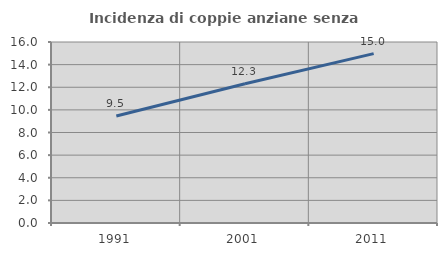
| Category | Incidenza di coppie anziane senza figli  |
|---|---|
| 1991.0 | 9.461 |
| 2001.0 | 12.309 |
| 2011.0 | 14.971 |